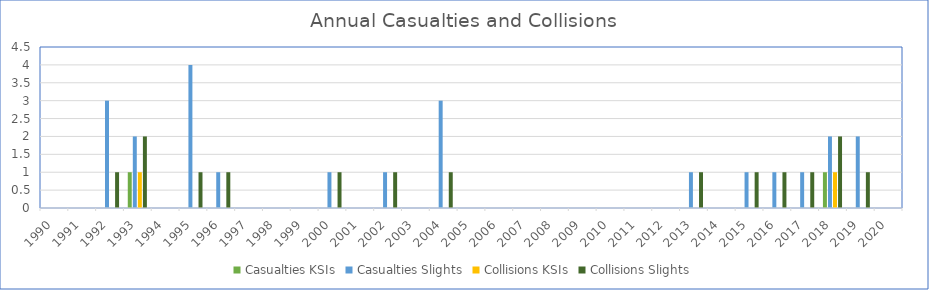
| Category | Casualties | Collisions |
|---|---|---|
| 1990.0 | 0 | 0 |
| 1991.0 | 0 | 0 |
| 1992.0 | 3 | 1 |
| 1993.0 | 2 | 2 |
| 1994.0 | 0 | 0 |
| 1995.0 | 4 | 1 |
| 1996.0 | 1 | 1 |
| 1997.0 | 0 | 0 |
| 1998.0 | 0 | 0 |
| 1999.0 | 0 | 0 |
| 2000.0 | 1 | 1 |
| 2001.0 | 0 | 0 |
| 2002.0 | 1 | 1 |
| 2003.0 | 0 | 0 |
| 2004.0 | 3 | 1 |
| 2005.0 | 0 | 0 |
| 2006.0 | 0 | 0 |
| 2007.0 | 0 | 0 |
| 2008.0 | 0 | 0 |
| 2009.0 | 0 | 0 |
| 2010.0 | 0 | 0 |
| 2011.0 | 0 | 0 |
| 2012.0 | 0 | 0 |
| 2013.0 | 1 | 1 |
| 2014.0 | 0 | 0 |
| 2015.0 | 1 | 1 |
| 2016.0 | 1 | 1 |
| 2017.0 | 1 | 1 |
| 2018.0 | 2 | 2 |
| 2019.0 | 2 | 1 |
| 2020.0 | 0 | 0 |